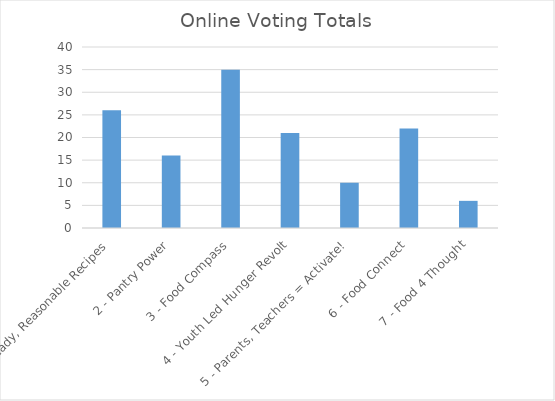
| Category | Online Voting Totals |
|---|---|
| 1 - Ready, Reasonable Recipes | 26 |
| 2 - Pantry Power | 16 |
| 3 - Food Compass | 35 |
| 4 - Youth Led Hunger Revolt | 21 |
| 5 - Parents, Teachers = Activate! | 10 |
| 6 - Food Connect | 22 |
| 7 - Food 4 Thought | 6 |